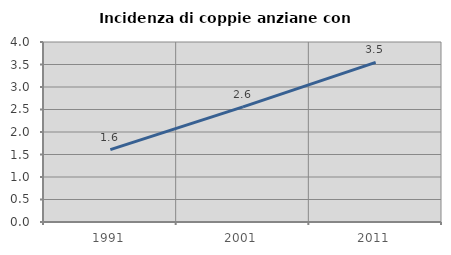
| Category | Incidenza di coppie anziane con figli |
|---|---|
| 1991.0 | 1.609 |
| 2001.0 | 2.559 |
| 2011.0 | 3.547 |